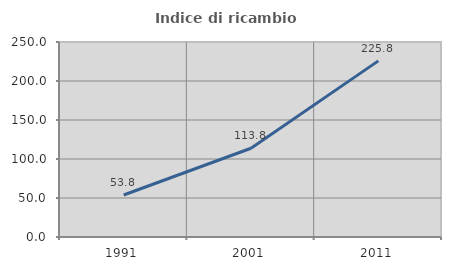
| Category | Indice di ricambio occupazionale  |
|---|---|
| 1991.0 | 53.846 |
| 2001.0 | 113.793 |
| 2011.0 | 225.806 |